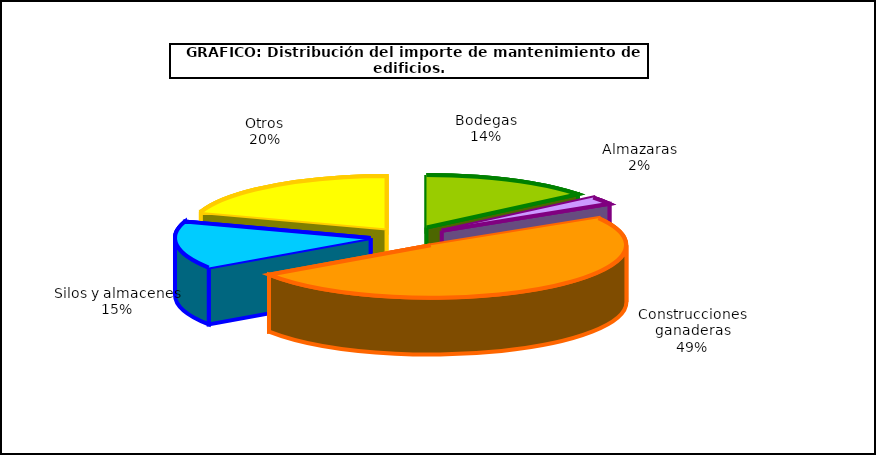
| Category | Series 0 |
|---|---|
| 0 | 72.755 |
| 1 | 11.848 |
| 2 | 253.758 |
| 3 | 75.31 |
| 4 | 102.827 |